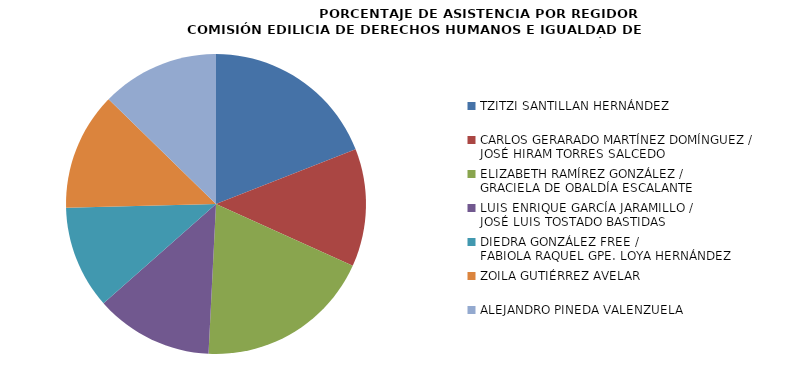
| Category | Series 0 |
|---|---|
| TZITZI SANTILLAN HERNÁNDEZ | 100 |
| CARLOS GERARADO MARTÍNEZ DOMÍNGUEZ /
JOSÉ HIRAM TORRES SALCEDO | 66.667 |
| ELIZABETH RAMÍREZ GONZÁLEZ /
GRACIELA DE OBALDÍA ESCALANTE | 100 |
| LUIS ENRIQUE GARCÍA JARAMILLO /
JOSÉ LUIS TOSTADO BASTIDAS | 66.667 |
| DIEDRA GONZÁLEZ FREE /
FABIOLA RAQUEL GPE. LOYA HERNÁNDEZ | 58.333 |
| ZOILA GUTIÉRREZ AVELAR | 66.667 |
| ALEJANDRO PINEDA VALENZUELA | 66.667 |